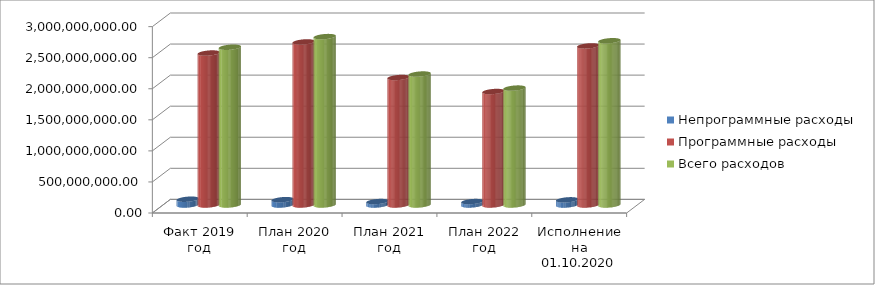
| Category | Непрограммные расходы | Программные расходы | Всего расходов |
|---|---|---|---|
| Факт 2019 год | 93276865.45 | 2446468858.11 | 2539745723.56 |
| План 2020 год | 85841522.09 | 2625067495.07 | 2710909017.16 |
| План 2021 год | 55666960 | 2052539081.16 | 2108206041.16 |
| План 2022 год | 55245660 | 1826900505.1 | 1882146165.1 |
| Исполнение на 01.10.2020 года | 83148306 | 2561058133.41 | 2644206439.41 |